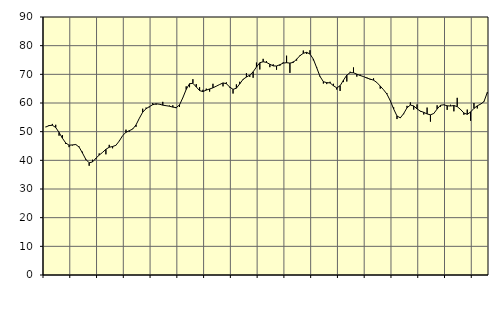
| Category | Piggar | Series 1 |
|---|---|---|
| nan | 51.7 | 51.6 |
| 87.0 | 52.3 | 52.12 |
| 87.0 | 52.7 | 52.24 |
| 87.0 | 52.4 | 51.45 |
| nan | 48.6 | 49.73 |
| 88.0 | 48.8 | 47.73 |
| 88.0 | 45.7 | 46.05 |
| 88.0 | 44.6 | 45.28 |
| nan | 45.2 | 45.38 |
| 89.0 | 45.6 | 45.51 |
| 89.0 | 44.8 | 44.62 |
| 89.0 | 43 | 42.55 |
| nan | 40.1 | 40.34 |
| 90.0 | 38.1 | 39.14 |
| 90.0 | 40.2 | 39.44 |
| 90.0 | 40.4 | 40.71 |
| nan | 42.4 | 41.83 |
| 91.0 | 42.8 | 42.77 |
| 91.0 | 42.1 | 43.85 |
| 91.0 | 45.4 | 44.57 |
| nan | 44.2 | 44.81 |
| 92.0 | 45.3 | 45.25 |
| 92.0 | 46.8 | 46.74 |
| 92.0 | 48.6 | 48.62 |
| nan | 50.7 | 49.78 |
| 93.0 | 50 | 50.34 |
| 93.0 | 51 | 50.9 |
| 93.0 | 51.7 | 52.35 |
| nan | 54.7 | 54.68 |
| 94.0 | 58 | 56.8 |
| 94.0 | 58.4 | 58 |
| 94.0 | 58.5 | 58.73 |
| nan | 60 | 59.42 |
| 95.0 | 59.4 | 59.73 |
| 95.0 | 59.5 | 59.58 |
| 95.0 | 60.4 | 59.25 |
| nan | 59.1 | 59.06 |
| 96.0 | 59.1 | 58.88 |
| 96.0 | 59.2 | 58.57 |
| 96.0 | 58.2 | 58.38 |
| nan | 58.6 | 59.33 |
| 97.0 | 61.9 | 61.85 |
| 97.0 | 65.8 | 64.73 |
| 97.0 | 65.5 | 66.73 |
| nan | 68.3 | 66.87 |
| 98.0 | 66.6 | 65.62 |
| 98.0 | 65.5 | 64.33 |
| 98.0 | 64.6 | 63.98 |
| nan | 65 | 64.5 |
| 99.0 | 64 | 64.89 |
| 99.0 | 66.7 | 65.29 |
| 99.0 | 65.9 | 65.87 |
| nan | 66.5 | 66.45 |
| 0.0 | 65.8 | 67 |
| 0.0 | 67.2 | 66.75 |
| 0.0 | 65.4 | 65.57 |
| nan | 63.3 | 64.75 |
| 1.0 | 66.5 | 65.16 |
| 1.0 | 67.4 | 66.67 |
| 1.0 | 68.1 | 68.26 |
| nan | 70.4 | 69.05 |
| 2.0 | 69.1 | 69.73 |
| 2.0 | 68.8 | 70.87 |
| 2.0 | 74.1 | 72.55 |
| nan | 71.7 | 74.05 |
| 3.0 | 75.4 | 74.39 |
| 3.0 | 74.6 | 74.16 |
| 3.0 | 72.5 | 73.52 |
| nan | 73.5 | 72.94 |
| 4.0 | 71.6 | 72.91 |
| 4.0 | 73 | 73.35 |
| 4.0 | 74.2 | 73.92 |
| nan | 76.5 | 74.06 |
| 5.0 | 70.5 | 73.91 |
| 5.0 | 74.5 | 74.17 |
| 5.0 | 74.8 | 75.28 |
| nan | 76.7 | 76.5 |
| 6.0 | 78.3 | 77.34 |
| 6.0 | 77.1 | 77.67 |
| 6.0 | 78.4 | 77.08 |
| nan | 74.9 | 75.3 |
| 7.0 | 72.5 | 72.3 |
| 7.0 | 69.4 | 69.25 |
| 7.0 | 66.8 | 67.43 |
| nan | 66.6 | 67.1 |
| 8.0 | 67.4 | 67.01 |
| 8.0 | 66.7 | 66.03 |
| 8.0 | 64.7 | 65.28 |
| nan | 64.2 | 66.02 |
| 9.0 | 67.3 | 67.95 |
| 9.0 | 67.5 | 69.74 |
| 9.0 | 70.9 | 70.59 |
| nan | 72.4 | 70.54 |
| 10.0 | 69.2 | 70.06 |
| 10.0 | 69.9 | 69.59 |
| 10.0 | 69.2 | 69.22 |
| nan | 68.9 | 68.71 |
| 11.0 | 68.1 | 68.33 |
| 11.0 | 68.6 | 67.97 |
| 11.0 | 67.2 | 67.13 |
| nan | 65 | 65.9 |
| 12.0 | 64.6 | 64.6 |
| 12.0 | 63.4 | 63.1 |
| 12.0 | 60.7 | 60.79 |
| nan | 58.5 | 57.91 |
| 13.0 | 54.4 | 55.47 |
| 13.0 | 55.1 | 54.82 |
| 13.0 | 56.1 | 56.31 |
| nan | 59 | 58.33 |
| 14.0 | 60.2 | 59.29 |
| 14.0 | 57.7 | 58.97 |
| 14.0 | 59.5 | 57.93 |
| nan | 57 | 57.16 |
| 15.0 | 56 | 56.74 |
| 15.0 | 58.4 | 56.19 |
| 15.0 | 53.5 | 55.87 |
| nan | 56.4 | 56.34 |
| 16.0 | 59.2 | 57.9 |
| 16.0 | 58.7 | 59.22 |
| 16.0 | 59.3 | 59.37 |
| nan | 57.6 | 59.03 |
| 17.0 | 59.4 | 58.95 |
| 17.0 | 57.1 | 59.12 |
| 17.0 | 61.8 | 58.74 |
| nan | 57.9 | 57.75 |
| 18.0 | 55.9 | 56.51 |
| 18.0 | 57.7 | 56.05 |
| 18.0 | 53.8 | 56.87 |
| nan | 60 | 58.11 |
| 19.0 | 58.1 | 59.02 |
| 19.0 | 59.7 | 59.61 |
| 19.0 | 60.6 | 60.48 |
| nan | 63.4 | 63.7 |